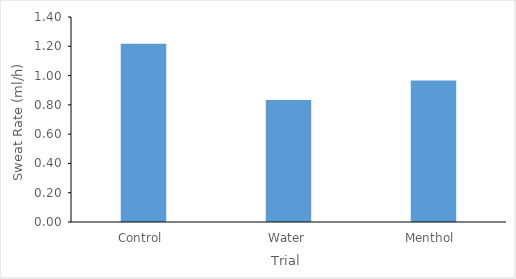
| Category | Series 0 |
|---|---|
| Control  | 1.217 |
| Water | 0.833 |
| Menthol  | 0.967 |